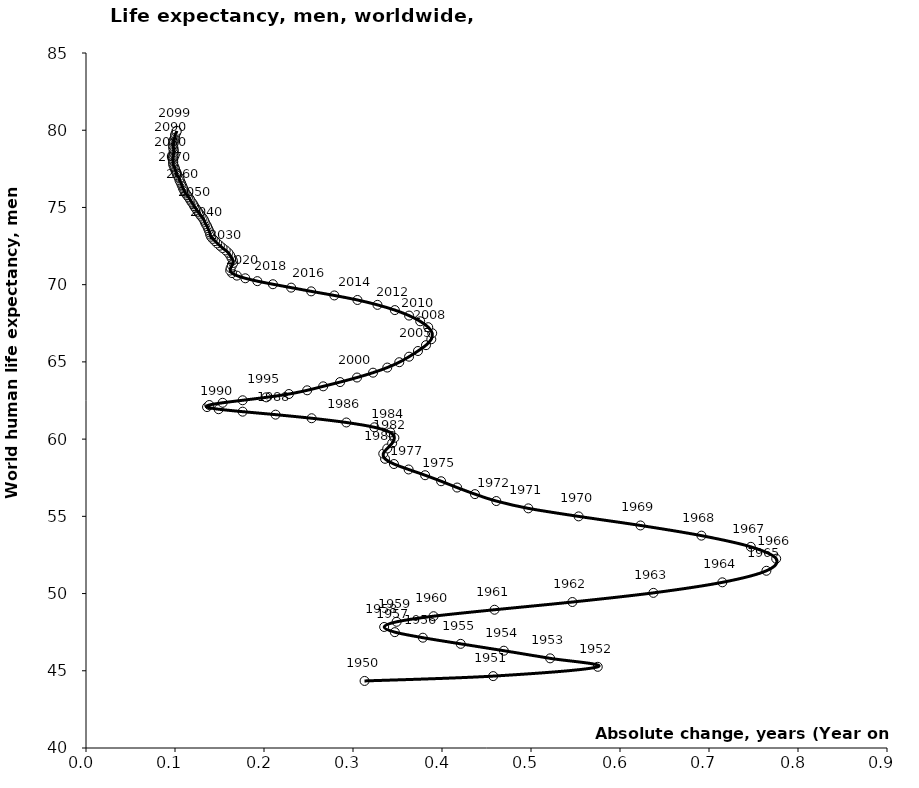
| Category | Series 0 |
|---|---|
| 0.3130000000000024 | 44.342 |
| 0.4574999999999996 | 44.655 |
| 0.5749999999999993 | 45.257 |
| 0.5214999999999996 | 45.805 |
| 0.46950000000000003 | 46.3 |
| 0.4210000000000029 | 46.744 |
| 0.37849999999999895 | 47.142 |
| 0.34699999999999775 | 47.501 |
| 0.33500000000000085 | 47.836 |
| 0.3490000000000002 | 48.171 |
| 0.3904999999999994 | 48.534 |
| 0.45899999999999963 | 48.952 |
| 0.5465000000000018 | 49.452 |
| 0.6374999999999993 | 50.045 |
| 0.7149999999999999 | 50.727 |
| 0.7645000000000017 | 51.475 |
| 0.775500000000001 | 52.256 |
| 0.7469999999999999 | 53.026 |
| 0.6914999999999978 | 53.75 |
| 0.6230000000000011 | 54.409 |
| 0.5534999999999997 | 54.996 |
| 0.4969999999999999 | 55.516 |
| 0.4610000000000021 | 55.99 |
| 0.4369999999999976 | 56.438 |
| 0.41699999999999804 | 56.864 |
| 0.3990000000000009 | 57.272 |
| 0.3810000000000002 | 57.662 |
| 0.3625000000000007 | 58.034 |
| 0.3460000000000001 | 58.387 |
| 0.3359999999999985 | 58.726 |
| 0.33399999999999963 | 59.059 |
| 0.3384999999999998 | 59.394 |
| 0.3440000000000012 | 59.736 |
| 0.3465000000000025 | 60.082 |
| 0.34199999999999875 | 60.429 |
| 0.32399999999999807 | 60.766 |
| 0.2925000000000004 | 61.077 |
| 0.2535000000000025 | 61.351 |
| 0.21300000000000097 | 61.584 |
| 0.17599999999999838 | 61.777 |
| 0.1490000000000009 | 61.936 |
| 0.13599999999999923 | 62.075 |
| 0.13849999999999696 | 62.208 |
| 0.15350000000000108 | 62.352 |
| 0.17600000000000193 | 62.515 |
| 0.20250000000000057 | 62.704 |
| 0.22799999999999798 | 62.92 |
| 0.24849999999999994 | 63.16 |
| 0.2665000000000006 | 63.417 |
| 0.285499999999999 | 63.693 |
| 0.30450000000000443 | 63.988 |
| 0.322499999999998 | 64.302 |
| 0.33849999999999625 | 64.633 |
| 0.35200000000000387 | 64.979 |
| 0.36299999999999955 | 65.337 |
| 0.37299999999999756 | 65.705 |
| 0.3819999999999979 | 66.083 |
| 0.3879999999999981 | 66.469 |
| 0.3890000000000029 | 66.859 |
| 0.38450000000000273 | 67.247 |
| 0.3755000000000024 | 67.628 |
| 0.36299999999999955 | 67.998 |
| 0.3469999999999942 | 68.354 |
| 0.32750000000000057 | 68.692 |
| 0.3050000000000068 | 69.009 |
| 0.27899999999999636 | 69.302 |
| 0.2530000000000001 | 69.567 |
| 0.23050000000000637 | 69.808 |
| 0.20999999999999375 | 70.028 |
| 0.19249999999999545 | 70.228 |
| 0.17900000000000205 | 70.413 |
| 0.16949999999999932 | 70.586 |
| 0.16400000000000148 | 70.752 |
| 0.16199999999999903 | 70.914 |
| 0.16250000000000142 | 71.076 |
| 0.16400000000000148 | 71.239 |
| 0.16549999999999443 | 71.404 |
| 0.16499999999999915 | 71.57 |
| 0.1635000000000062 | 71.734 |
| 0.16200000000000614 | 71.897 |
| 0.1599999999999966 | 72.058 |
| 0.15699999999999648 | 72.217 |
| 0.15350000000000108 | 72.372 |
| 0.15050000000000097 | 72.524 |
| 0.14750000000000085 | 72.673 |
| 0.14499999999999602 | 72.819 |
| 0.1424999999999983 | 72.963 |
| 0.14050000000000296 | 73.104 |
| 0.13949999999999818 | 73.244 |
| 0.1390000000000029 | 73.383 |
| 0.13800000000000523 | 73.522 |
| 0.13700000000000045 | 73.659 |
| 0.13599999999999568 | 73.796 |
| 0.13449999999999562 | 73.931 |
| 0.13349999999999795 | 74.065 |
| 0.13250000000000028 | 74.198 |
| 0.13100000000000023 | 74.33 |
| 0.12899999999999778 | 74.46 |
| 0.12750000000000483 | 74.588 |
| 0.12600000000000477 | 74.715 |
| 0.12449999999999761 | 74.84 |
| 0.12299999999999756 | 74.964 |
| 0.1214999999999975 | 75.086 |
| 0.12049999999999983 | 75.207 |
| 0.11899999999999977 | 75.327 |
| 0.11749999999999972 | 75.445 |
| 0.11650000000000205 | 75.562 |
| 0.11500000000000199 | 75.678 |
| 0.11350000000000193 | 75.792 |
| 0.11200000000000188 | 75.905 |
| 0.1109999999999971 | 76.016 |
| 0.10999999999999943 | 76.127 |
| 0.10900000000000176 | 76.236 |
| 0.10849999999999937 | 76.345 |
| 0.1075000000000017 | 76.453 |
| 0.10699999999999932 | 76.56 |
| 0.10600000000000165 | 76.667 |
| 0.10499999999999687 | 76.772 |
| 0.10499999999999687 | 76.877 |
| 0.1039999999999992 | 76.982 |
| 0.10249999999999915 | 77.085 |
| 0.10200000000000387 | 77.187 |
| 0.10150000000000148 | 77.289 |
| 0.1004999999999967 | 77.39 |
| 0.10000000000000142 | 77.49 |
| 0.09949999999999903 | 77.59 |
| 0.09850000000000136 | 77.689 |
| 0.09800000000000608 | 77.787 |
| 0.09799999999999898 | 77.885 |
| 0.09799999999999898 | 77.983 |
| 0.09749999999999659 | 78.081 |
| 0.09749999999999659 | 78.178 |
| 0.09799999999999898 | 78.276 |
| 0.09799999999999898 | 78.374 |
| 0.09850000000000136 | 78.472 |
| 0.09850000000000136 | 78.571 |
| 0.09850000000000136 | 78.669 |
| 0.09850000000000136 | 78.768 |
| 0.09799999999999898 | 78.866 |
| 0.09799999999999898 | 78.964 |
| 0.09799999999999898 | 79.062 |
| 0.09850000000000136 | 79.16 |
| 0.09850000000000136 | 79.259 |
| 0.09850000000000136 | 79.357 |
| 0.09949999999999903 | 79.456 |
| 0.10000000000000142 | 79.556 |
| 0.10000000000000142 | 79.656 |
| 0.1004999999999967 | 79.756 |
| 0.10150000000000148 | 79.857 |
| 0.10200000000000387 | 79.959 |